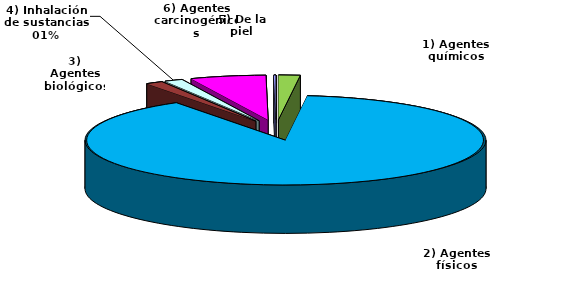
| Category | Total nº |
|---|---|
| 1) Agentes químicos | 20 |
| 2) Agentes físicos | 1021 |
| 3) Agentes biológicos | 16 |
| 4) Inhalación de sustancias | 17 |
| 5) De la piel | 70 |
| 6) Agentes carcinogénicos | 2 |